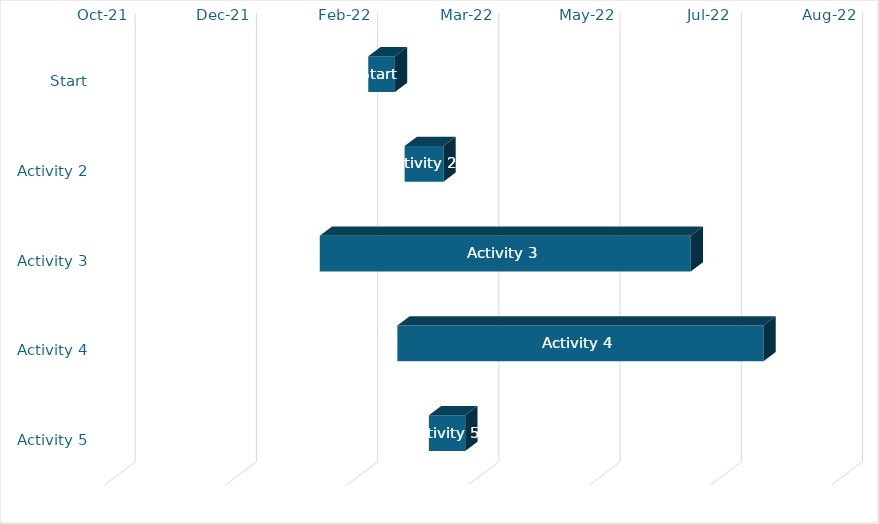
| Category | date | duration |
|---|---|---|
| Start | 2/13/22 | 11 |
| Activity 2 | 2/28/22 | 16 |
| Activity 3 | 1/24/22 | 153 |
| Activity 4 | 2/25/22 | 151 |
| Activity 5 | 3/10/22 | 15 |